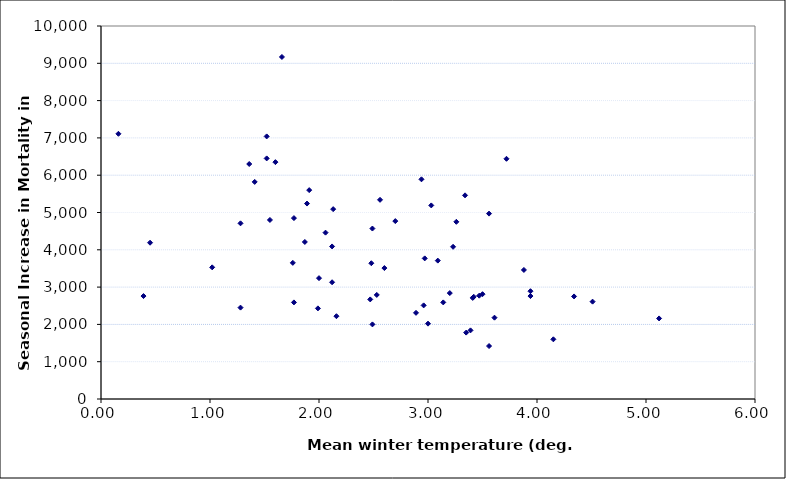
| Category | Seas Incr. Mort. |
|---|---|
| 1.89 | 5240 |
| 2.94 | 5890 |
| 2.7 | 4770 |
| 1.41 | 5820 |
| 1.52 | 6450 |
| 3.47 | 2770 |
| 2.06 | 4460 |
| 1.66 | 9170 |
| 2.12 | 4090 |
| 2.56 | 5340 |
| 2.13 | 5090 |
| 0.16 | 7110 |
| 3.09 | 3710 |
| 1.87 | 4210 |
| 1.6 | 6350 |
| 3.0 | 2020 |
| 1.91 | 5600 |
| 1.55 | 4800 |
| 1.52 | 7040 |
| 3.41 | 2710 |
| 3.56 | 4970 |
| 3.23 | 4080 |
| 3.5 | 2810 |
| 3.88 | 3460 |
| 3.72 | 6440 |
| 1.02 | 3530 |
| 1.77 | 4850 |
| 0.45 | 4190 |
| 2.47 | 2670 |
| 2.97 | 3770 |
| 1.36 | 6300 |
| 2.49 | 4570 |
| 2.53 | 2790 |
| 2.12 | 3130 |
| 1.28 | 4710 |
| 2.0 | 3240 |
| 3.14 | 2590 |
| 5.12 | 2160 |
| 3.34 | 5460 |
| 1.99 | 2430 |
| 3.94 | 2890 |
| 3.42 | 2740 |
| 1.77 | 2590 |
| 2.89 | 2310 |
| 1.76 | 3650 |
| 2.48 | 3640 |
| 4.51 | 2610 |
| 3.26 | 4750 |
| 3.03 | 5190 |
| 2.16 | 2220 |
| 3.39 | 1840 |
| 2.96 | 2510 |
| 3.2 | 2840 |
| 3.94 | 2760 |
| 3.35 | 1780 |
| 4.34 | 2750 |
| 3.61 | 2180 |
| 2.6 | 3510 |
| 0.39 | 2760 |
| 1.28 | 2450 |
| 3.56 | 1420 |
| 2.49 | 2000 |
| 4.15 | 1600 |